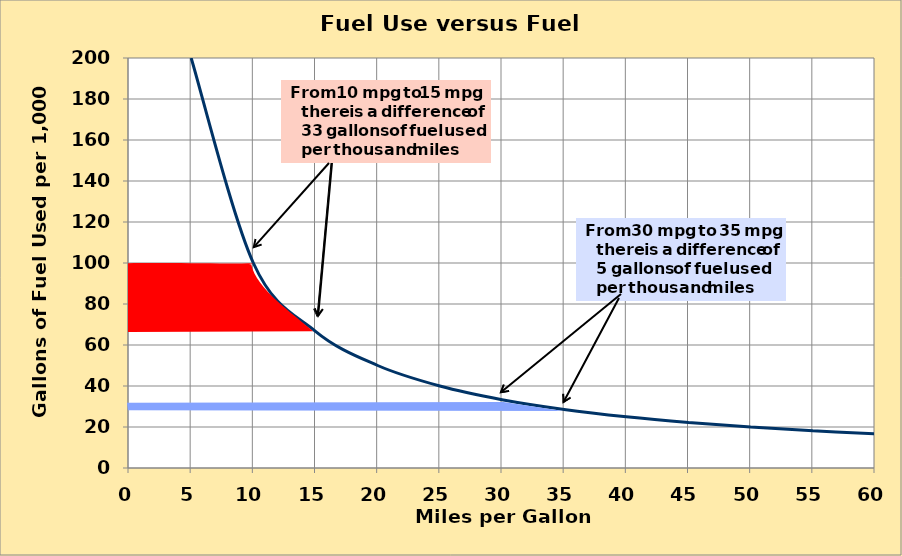
| Category | Gallons Per 
1,000 Miles |
|---|---|
| 0.0 | 1000000 |
| 5.0 | 200 |
| 10.0 | 100 |
| 15.0 | 66.667 |
| 20.0 | 50 |
| 25.0 | 40 |
| 30.0 | 33.333 |
| 35.0 | 28.571 |
| 40.0 | 25 |
| 45.0 | 22.222 |
| 50.0 | 20 |
| 55.0 | 18.182 |
| 60.0 | 16.667 |